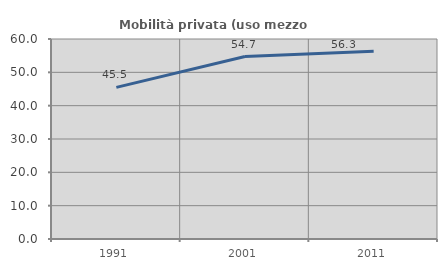
| Category | Mobilità privata (uso mezzo privato) |
|---|---|
| 1991.0 | 45.488 |
| 2001.0 | 54.737 |
| 2011.0 | 56.312 |